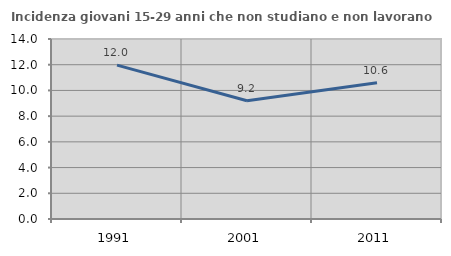
| Category | Incidenza giovani 15-29 anni che non studiano e non lavorano  |
|---|---|
| 1991.0 | 11.968 |
| 2001.0 | 9.192 |
| 2011.0 | 10.601 |